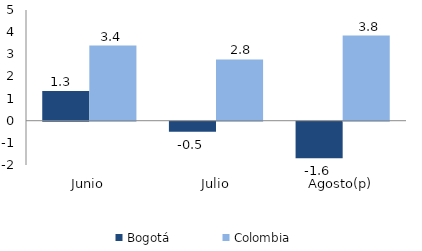
| Category | Bogotá | Colombia |
|---|---|---|
| Junio | 1.342 | 3.396 |
| Julio | -0.458 | 2.767 |
| Agosto(p) | -1.648 | 3.844 |